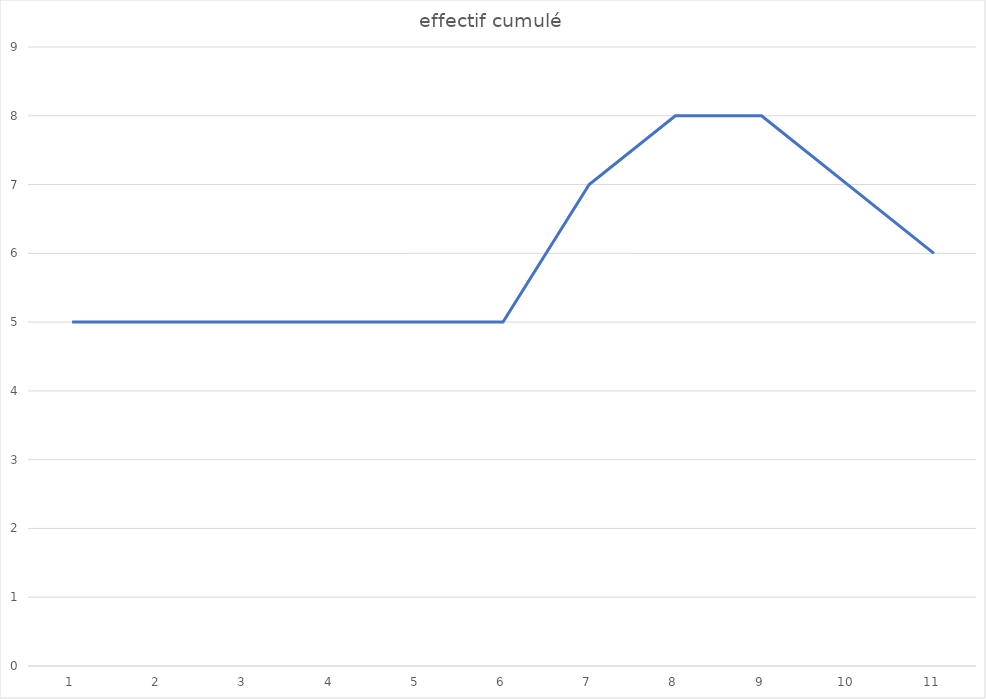
| Category | effectif cumulé |
|---|---|
| 0 | 5 |
| 1 | 5 |
| 2 | 5 |
| 3 | 5 |
| 4 | 5 |
| 5 | 5 |
| 6 | 7 |
| 7 | 8 |
| 8 | 8 |
| 9 | 7 |
| 10 | 6 |